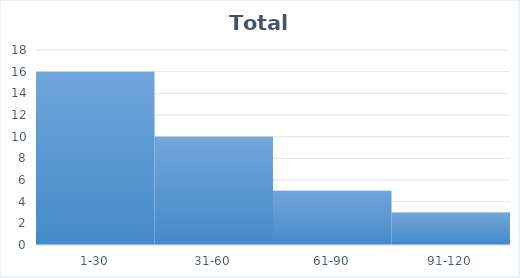
| Category | Total |
|---|---|
| 1-30 | 16 |
| 31-60 | 10 |
| 61-90 | 5 |
| 91-120 | 3 |